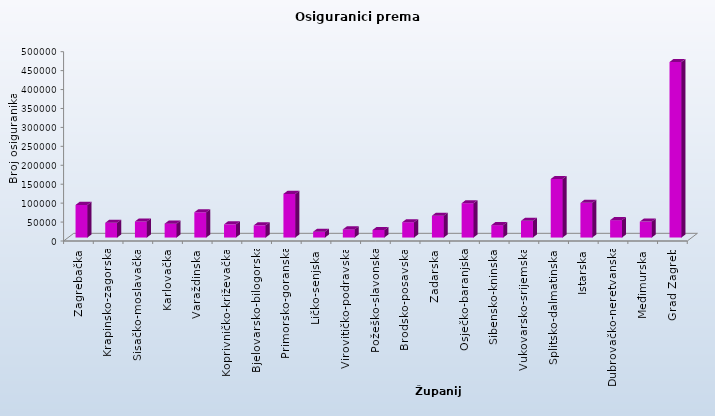
| Category | Series 0 |
|---|---|
| Zagrebačka | 86078 |
| Krapinsko-zagorska | 39053 |
| Sisačko-moslavačka | 42440 |
| Karlovačka | 36687 |
| Varaždinska | 66738 |
| Koprivničko-križevačka | 34855 |
| Bjelovarsko-bilogorska | 32270 |
| Primorsko-goranska | 115259 |
| Ličko-senjska | 15381 |
| Virovitičko-podravska | 21537 |
| Požeško-slavonska | 19904 |
| Brodsko-posavska | 40491 |
| Zadarska | 57614 |
| Osječko-baranjska | 90677 |
| Šibensko-kninska | 32705 |
| Vukovarsko-srijemska | 44141 |
| Splitsko-dalmatinska | 154601 |
| Istarska | 91760 |
| Dubrovačko-neretvanska | 45913 |
| Međimurska | 42165 |
| Grad Zagreb | 463680 |